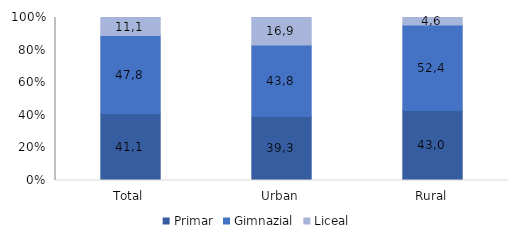
| Category | Primar | Gimnazial | Liceal |
|---|---|---|---|
| Total | 41.1 | 47.8 | 11.1 |
| Urban | 39.3 | 43.8 | 16.9 |
| Rural | 43 | 52.4 | 4.6 |